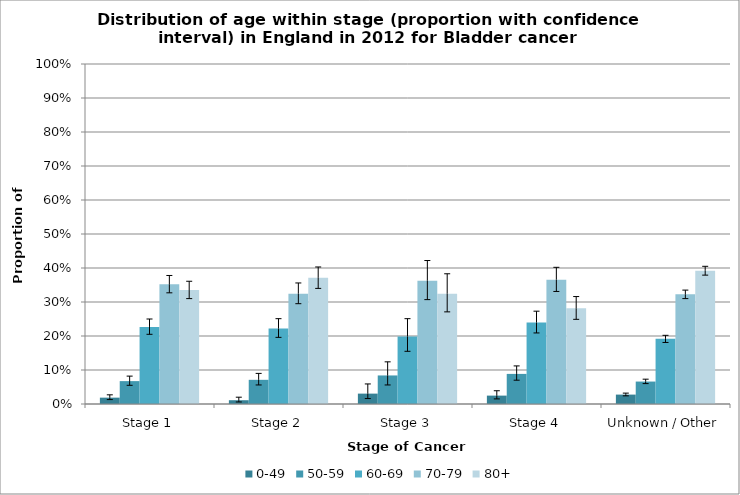
| Category | 0-49 | 50-59 | 60-69 | 70-79 | 80+ |
|---|---|---|---|---|---|
| Stage 1 | 0.019 | 0.067 | 0.227 | 0.352 | 0.335 |
| Stage 2 | 0.011 | 0.071 | 0.222 | 0.324 | 0.371 |
| Stage 3 | 0.031 | 0.084 | 0.198 | 0.363 | 0.324 |
| Stage 4 | 0.025 | 0.089 | 0.239 | 0.366 | 0.282 |
| Unknown / Other | 0.028 | 0.066 | 0.192 | 0.323 | 0.392 |